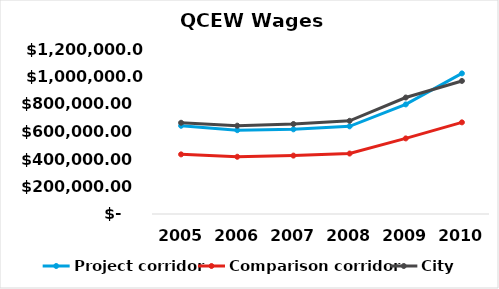
| Category | Project corridor | Comparison corridor | City |
|---|---|---|---|
| 2005.0 | 641661 | 433660 | 663497.167 |
| 2006.0 | 609577.95 | 416313.6 | 642414.938 |
| 2007.0 | 615795.645 | 424723.135 | 654544.462 |
| 2008.0 | 637594.811 | 439758.334 | 677715.336 |
| 2009.0 | 796993.514 | 549697.917 | 847144.17 |
| 2010.0 | 1022542.678 | 666536.209 | 967640.837 |